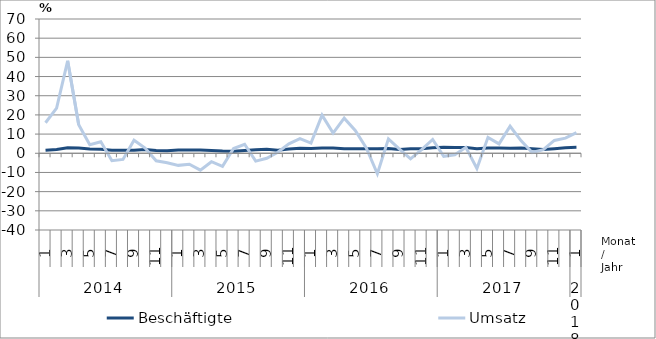
| Category | Beschäftigte | Umsatz |
|---|---|---|
| 0 | 1.6 | 15.9 |
| 1 | 2 | 23.5 |
| 2 | 2.9 | 48.2 |
| 3 | 2.8 | 14.9 |
| 4 | 2.2 | 4.5 |
| 5 | 2.1 | 6 |
| 6 | 1.6 | -3.9 |
| 7 | 1.6 | -3.2 |
| 8 | 1.6 | 6.8 |
| 9 | 2 | 2.7 |
| 10 | 1.4 | -3.9 |
| 11 | 1.3 | -4.9 |
| 12 | 1.7 | -6.3 |
| 13 | 1.7 | -5.7 |
| 14 | 1.7 | -8.8 |
| 15 | 1.5 | -4.4 |
| 16 | 1.2 | -6.8 |
| 17 | 1.1 | 2.5 |
| 18 | 1.5 | 4.7 |
| 19 | 1.8 | -4.1 |
| 20 | 2.1 | -2.6 |
| 21 | 1.6 | 0.5 |
| 22 | 2.2 | 4.9 |
| 23 | 2.6 | 7.6 |
| 24 | 2.5 | 5.3 |
| 25 | 2.7 | 19.9 |
| 26 | 2.8 | 10.5 |
| 27 | 2.4 | 18.3 |
| 28 | 2.4 | 11.9 |
| 29 | 2.4 | 2.8 |
| 30 | 2.3 | -10.7 |
| 31 | 2.5 | 7.5 |
| 32 | 2 | 2.2 |
| 33 | 2.4 | -2.9 |
| 34 | 2.3 | 1.9 |
| 35 | 2.9 | 7.2 |
| 36 | 3.1 | -1.6 |
| 37 | 3 | -0.8 |
| 38 | 3 | 3.1 |
| 39 | 2.4 | -7.9 |
| 40 | 2.8 | 8.3 |
| 41 | 2.7 | 4.9 |
| 42 | 2.6 | 14.1 |
| 43 | 2.7 | 6.5 |
| 44 | 2.3 | 0.4 |
| 45 | 2 | 1.9 |
| 46 | 2.4 | 6.7 |
| 47 | 2.9 | 7.9 |
| 48 | 3.1 | 10.8 |